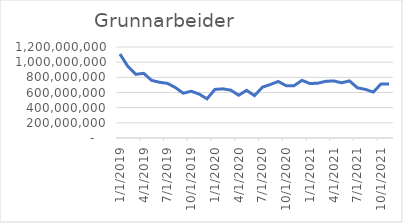
| Category | Grunnarbeider |
|---|---|
| 1/1/19 | 1107520000 |
| 2/1/19 | 943736666.667 |
| 3/1/19 | 839494166.667 |
| 4/1/19 | 852822500 |
| 5/1/19 | 759795000 |
| 6/1/19 | 734403333.333 |
| 7/1/19 | 720636666.667 |
| 8/1/19 | 665210833.333 |
| 9/1/19 | 590431666.667 |
| 10/1/19 | 616495833.333 |
| 11/1/19 | 579412500 |
| 12/1/19 | 516575000 |
| 1/1/20 | 640800000 |
| 2/1/20 | 648208333.333 |
| 3/1/20 | 631191666.667 |
| 4/1/20 | 563804166.667 |
| 5/1/20 | 628641666.667 |
| 6/1/20 | 558670833.333 |
| 7/1/20 | 670154166.667 |
| 8/1/20 | 705409166.667 |
| 9/1/20 | 745433750 |
| 10/1/20 | 690117083.333 |
| 11/1/20 | 689667083.333 |
| 12/1/20 | 760250416.667 |
| 1/1/21 | 717837916.667 |
| 2/1/21 | 722633750 |
| 3/1/21 | 747525416.667 |
| 4/1/21 | 752779583.333 |
| 5/1/21 | 728075416.667 |
| 6/1/21 | 753058750 |
| 7/1/21 | 661925416.667 |
| 8/1/21 | 641632916.667 |
| 9/1/21 | 606566666.667 |
| 10/1/21 | 712704166.667 |
| 11/1/21 | 711070833.333 |